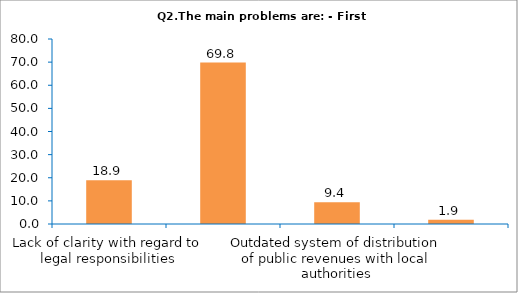
| Category | Series 0 |
|---|---|
| Lack of clarity with regard to legal responsibilities | 18.868 |
| Insufficient allocation of financial resources for legally assigned competencies | 69.811 |
| Outdated system of distribution of public revenues with local authorities | 9.434 |
| Obstacles to cooperation with other levels and units of administration | 1.887 |